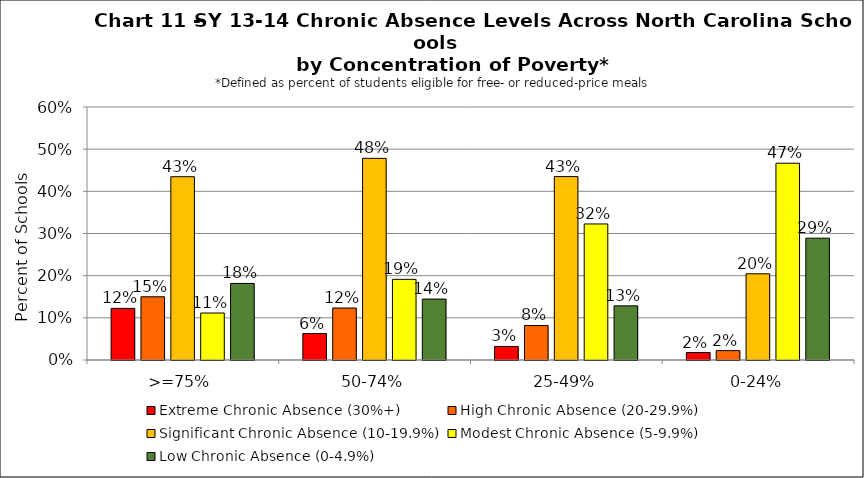
| Category | Extreme Chronic Absence (30%+) | High Chronic Absence (20-29.9%) | Significant Chronic Absence (10-19.9%) | Modest Chronic Absence (5-9.9%) | Low Chronic Absence (0-4.9%) |
|---|---|---|---|---|---|
| 0 | 0.122 | 0.15 | 0.435 | 0.111 | 0.182 |
| 1 | 0.063 | 0.123 | 0.478 | 0.191 | 0.145 |
| 2 | 0.032 | 0.082 | 0.435 | 0.323 | 0.128 |
| 3 | 0.018 | 0.022 | 0.204 | 0.467 | 0.289 |